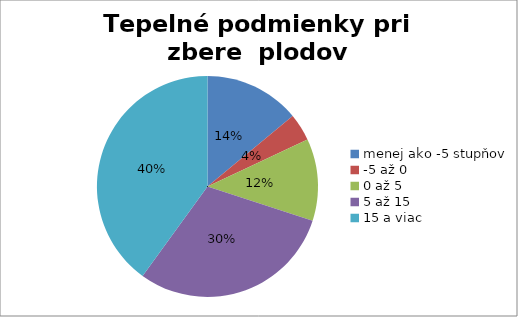
| Category | Series 0 |
|---|---|
| menej ako -5 stupňov | 7 |
| -5 až 0 | 2 |
| 0 až 5 | 6 |
| 5 až 15 | 15 |
| 15 a viac | 20 |